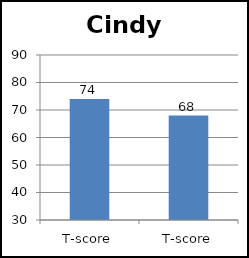
| Category | Cindy |
|---|---|
| T-score | 74 |
| T-score | 68 |